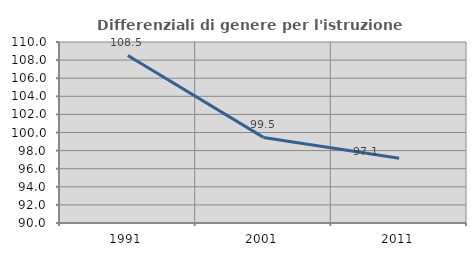
| Category | Differenziali di genere per l'istruzione superiore |
|---|---|
| 1991.0 | 108.515 |
| 2001.0 | 99.458 |
| 2011.0 | 97.144 |